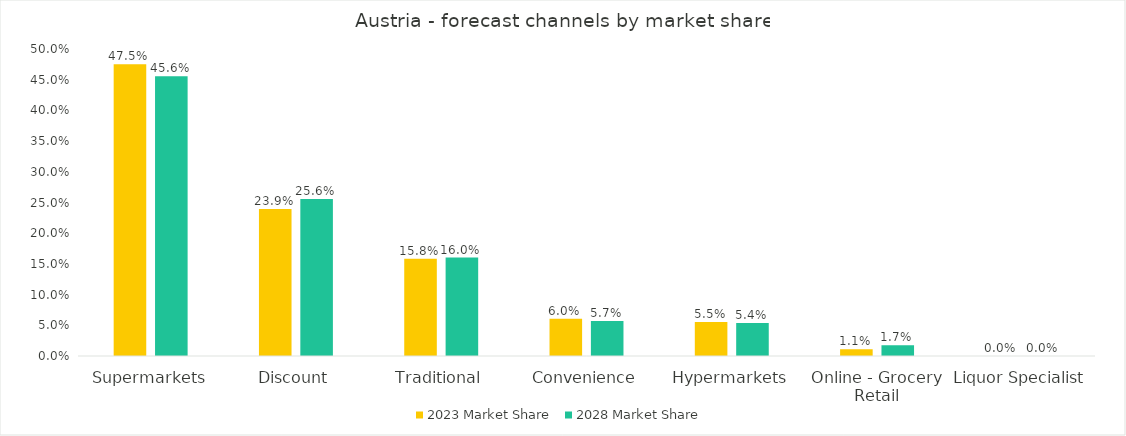
| Category | 2023 Market Share | 2028 Market Share |
|---|---|---|
| Supermarkets | 0.475 | 0.456 |
| Discount | 0.239 | 0.256 |
| Traditional | 0.158 | 0.16 |
| Convenience | 0.06 | 0.057 |
| Hypermarkets | 0.055 | 0.054 |
| Online - Grocery Retail | 0.011 | 0.017 |
| Liquor Specialist | 0 | 0 |